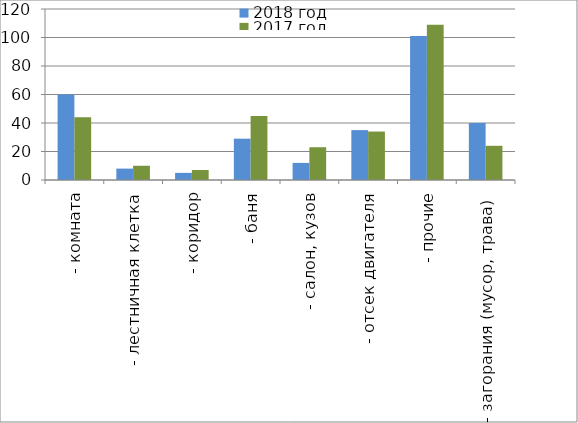
| Category | 2018 год | 2017 год |
|---|---|---|
|  - комната | 60 | 44 |
|  - лестничная клетка | 8 | 10 |
|  - коридор | 5 | 7 |
|  - баня | 29 | 45 |
|  - салон, кузов | 12 | 23 |
|  - отсек двигателя | 35 | 34 |
| - прочие | 101 | 109 |
| - загорания (мусор, трава)  | 40 | 24 |